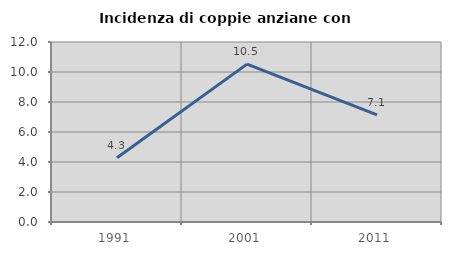
| Category | Incidenza di coppie anziane con figli |
|---|---|
| 1991.0 | 4.286 |
| 2001.0 | 10.526 |
| 2011.0 | 7.143 |